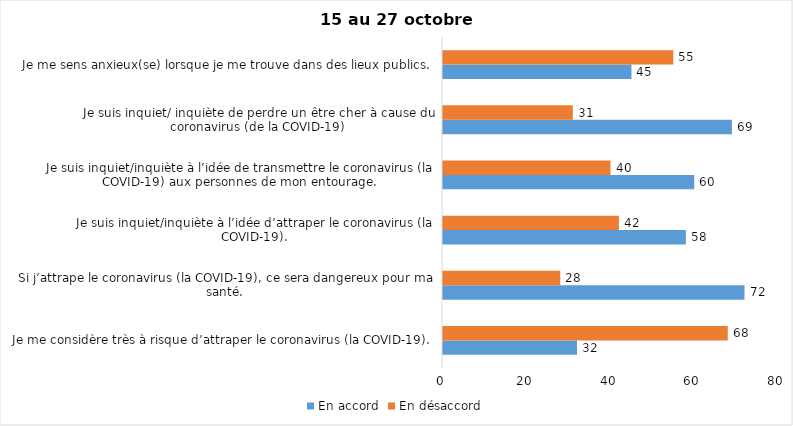
| Category | En accord | En désaccord |
|---|---|---|
| Je me considère très à risque d’attraper le coronavirus (la COVID-19). | 32 | 68 |
| Si j’attrape le coronavirus (la COVID-19), ce sera dangereux pour ma santé. | 72 | 28 |
| Je suis inquiet/inquiète à l’idée d’attraper le coronavirus (la COVID-19). | 58 | 42 |
| Je suis inquiet/inquiète à l’idée de transmettre le coronavirus (la COVID-19) aux personnes de mon entourage. | 60 | 40 |
| Je suis inquiet/ inquiète de perdre un être cher à cause du coronavirus (de la COVID-19) | 69 | 31 |
| Je me sens anxieux(se) lorsque je me trouve dans des lieux publics. | 45 | 55 |